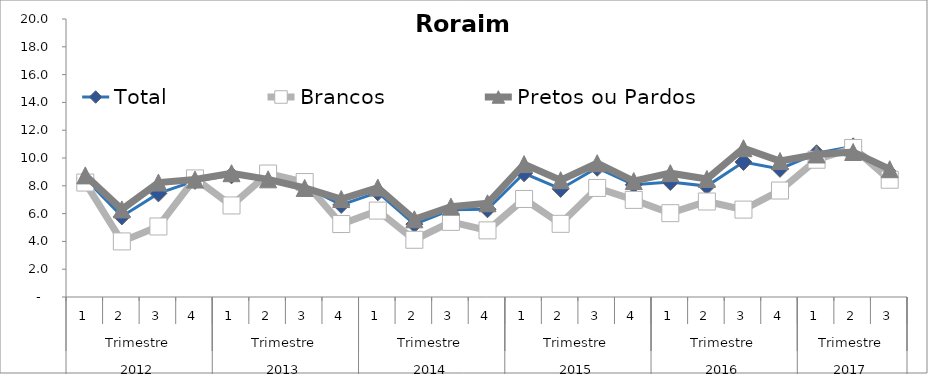
| Category | Total | Brancos | Pretos ou Pardos |
|---|---|---|---|
| 0 | 8.509 | 8.232 | 8.749 |
| 1 | 5.795 | 3.999 | 6.301 |
| 2 | 7.453 | 5.074 | 8.233 |
| 3 | 8.353 | 8.531 | 8.449 |
| 4 | 8.753 | 6.586 | 8.905 |
| 5 | 8.566 | 8.883 | 8.465 |
| 6 | 7.951 | 8.269 | 7.843 |
| 7 | 6.621 | 5.249 | 7.047 |
| 8 | 7.53 | 6.216 | 7.869 |
| 9 | 5.241 | 4.117 | 5.591 |
| 10 | 6.273 | 5.405 | 6.5 |
| 11 | 6.312 | 4.794 | 6.743 |
| 12 | 8.899 | 7.052 | 9.56 |
| 13 | 7.774 | 5.264 | 8.403 |
| 14 | 9.297 | 7.847 | 9.624 |
| 15 | 8.073 | 6.986 | 8.34 |
| 16 | 8.272 | 6.031 | 8.908 |
| 17 | 7.979 | 6.871 | 8.491 |
| 18 | 9.71 | 6.287 | 10.704 |
| 19 | 9.218 | 7.661 | 9.78 |
| 20 | 10.342 | 9.874 | 10.255 |
| 21 | 10.838 | 10.721 | 10.431 |
| 22 | 8.911 | 8.435 | 9.194 |